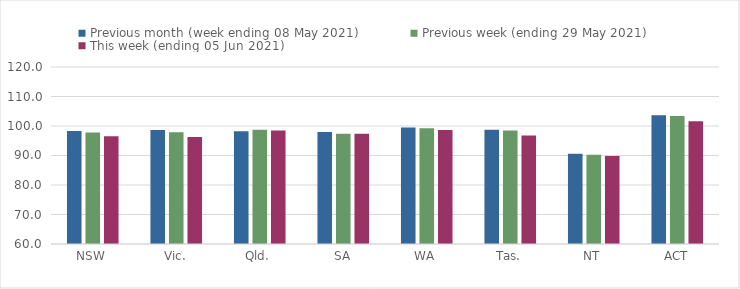
| Category | Previous month (week ending 08 May 2021) | Previous week (ending 29 May 2021) | This week (ending 05 Jun 2021) |
|---|---|---|---|
| NSW | 98.28 | 97.82 | 96.49 |
| Vic. | 98.62 | 97.89 | 96.28 |
| Qld. | 98.22 | 98.71 | 98.5 |
| SA | 97.99 | 97.38 | 97.38 |
| WA | 99.53 | 99.24 | 98.62 |
| Tas. | 98.7 | 98.45 | 96.76 |
| NT | 90.63 | 90.24 | 89.82 |
| ACT | 103.66 | 103.42 | 101.64 |